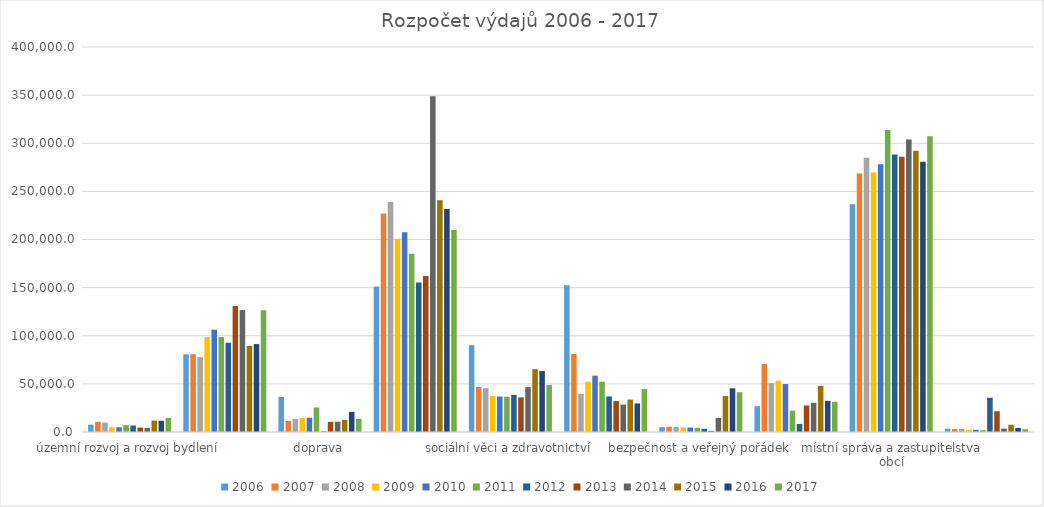
| Category | 2006 | 2007 | 2008 | 2009 | 2010 | 2011 | 2012 | 2013 | 2014 | 2015 | 2016 | 2017 |
|---|---|---|---|---|---|---|---|---|---|---|---|---|
| územní rozvoj a rozvoj bydlení | 7596 | 10542 | 9740 | 4930 | 4875 | 7108 | 6754.2 | 4584.2 | 4100 | 11866 | 11663.7 | 14670 |
| městská zeleň a ochrana životního prostředí | 80730 | 80810 | 77734 | 98647 | 106322 | 98598.9 | 92785 | 130940 | 126716 | 89452 | 91323.5 | 126477 |
| doprava | 36500 | 11500 | 13725 | 14550 | 14800 | 25500 | 600 | 10550 | 10756.1 | 12650 | 20925 | 13655 |
| školství | 151060.8 | 227128.9 | 238854.7 | 200770.2 | 207537.8 | 185314.4 | 155411 | 162015 | 348938.6 | 240715.2 | 231638.7 | 209976.1 |
| sociální věci a zdravotnictví | 90182 | 46785.8 | 45499.7 | 37476.2 | 36870 | 36688 | 38568.8 | 35988 | 46548 | 65325 | 63331.5 | 48920 |
| kultura | 152558.5 | 81041 | 39579.5 | 52298 | 58560.3 | 52268 | 36986 | 32089 | 28482 | 33701.3 | 29680.5 | 44549 |
| bezpečnost a veřejný pořádek | 5005 | 5480 | 5240 | 4940 | 4630 | 4320 | 3285 | 1189 | 14548 | 37369 | 45421 | 41355.1 |
| bytové hospodářství | 26770 | 70558 | 50752 | 53350 | 49830 | 22132 | 8375.1 | 27597.2 | 30337 | 47969.2 | 32375.4 | 31347 |
| místní správa a zastupitelstva obcí | 236670.8 | 268507 | 285020.2 | 269894.4 | 278311 | 313837.7 | 288255.5 | 285937.9 | 303899.9 | 292259 | 280680.1 | 307306.1 |
| ostatní činnosti | 3460.5 | 3160 | 3160 | 2224 | 2310 | 1925 | 35588.5 | 21568 | 3531.3 | 7537 | 4161.7 | 2850 |